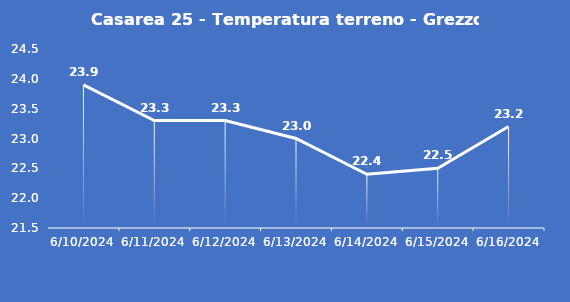
| Category | Casarea 25 - Temperatura terreno - Grezzo (°C) |
|---|---|
| 6/10/24 | 23.9 |
| 6/11/24 | 23.3 |
| 6/12/24 | 23.3 |
| 6/13/24 | 23 |
| 6/14/24 | 22.4 |
| 6/15/24 | 22.5 |
| 6/16/24 | 23.2 |